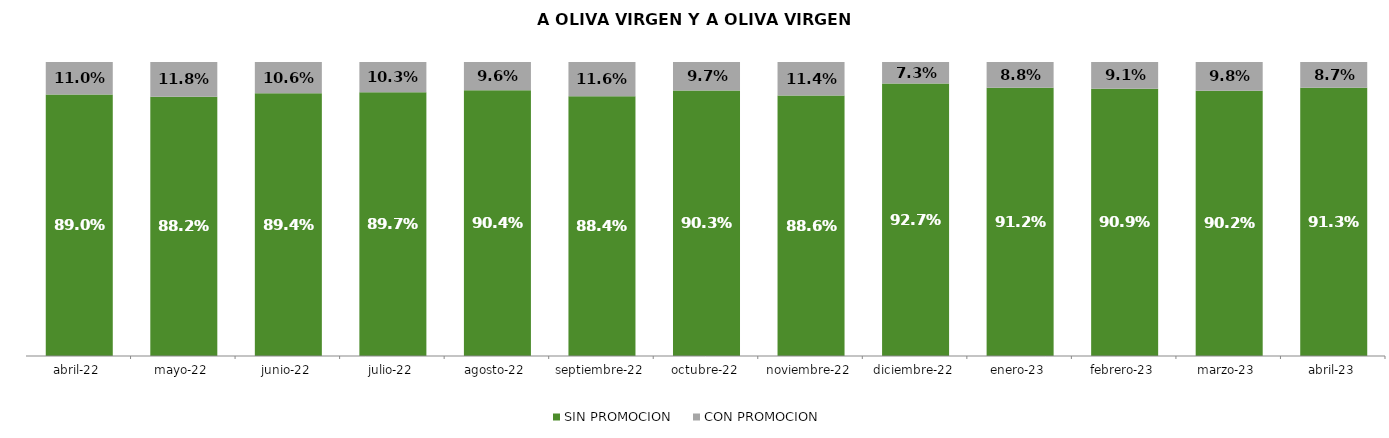
| Category | SIN PROMOCION   | CON PROMOCION   |
|---|---|---|
| 2022-04-01 | 0.89 | 0.11 |
| 2022-05-01 | 0.882 | 0.118 |
| 2022-06-01 | 0.894 | 0.106 |
| 2022-07-01 | 0.897 | 0.103 |
| 2022-08-01 | 0.904 | 0.096 |
| 2022-09-01 | 0.884 | 0.116 |
| 2022-10-01 | 0.903 | 0.097 |
| 2022-11-01 | 0.886 | 0.114 |
| 2022-12-01 | 0.927 | 0.073 |
| 2023-01-01 | 0.912 | 0.088 |
| 2023-02-01 | 0.909 | 0.091 |
| 2023-03-01 | 0.902 | 0.098 |
| 2023-04-01 | 0.913 | 0.087 |